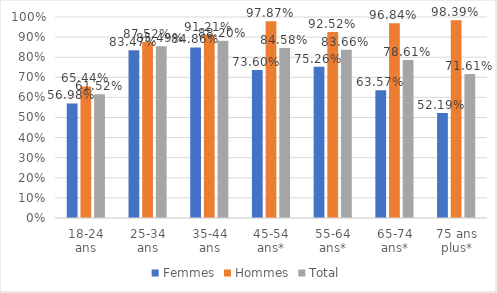
| Category | Femmes | Hommes | Total |
|---|---|---|---|
| 18-24 ans | 0.57 | 0.654 | 0.615 |
| 25-34 ans | 0.835 | 0.875 | 0.855 |
| 35-44 ans | 0.849 | 0.912 | 0.882 |
| 45-54 ans* | 0.736 | 0.979 | 0.846 |
| 55-64 ans* | 0.753 | 0.925 | 0.837 |
| 65-74 ans* | 0.636 | 0.968 | 0.786 |
| 75 ans plus* | 0.522 | 0.984 | 0.716 |